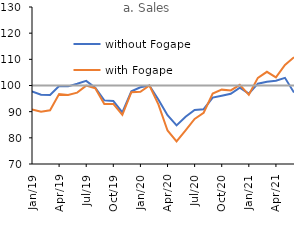
| Category | without Fogape | with Fogape | Series 2 |
|---|---|---|---|
| 2019-01-01 | 97.763 | 90.879 | 100 |
| 2019-02-01 | 96.495 | 89.952 | 100 |
| 2019-03-01 | 96.37 | 90.544 | 100 |
| 2019-04-01 | 99.784 | 96.74 | 100 |
| 2019-05-01 | 99.67 | 96.398 | 100 |
| 2019-06-01 | 100.644 | 97.279 | 100 |
| 2019-07-01 | 101.764 | 99.944 | 100 |
| 2019-08-01 | 99.19 | 98.973 | 100 |
| 2019-09-01 | 94.308 | 92.929 | 100 |
| 2019-10-01 | 94.094 | 92.975 | 100 |
| 2019-11-01 | 89.705 | 88.787 | 100 |
| 2019-12-01 | 97.803 | 97.458 | 100 |
| 2020-01-01 | 99.343 | 97.621 | 100 |
| 2020-02-01 | 100 | 100 | 100 |
| 2020-03-01 | 94.577 | 92.68 | 100 |
| 2020-04-01 | 88.648 | 82.816 | 100 |
| 2020-05-01 | 84.763 | 78.672 | 100 |
| 2020-06-01 | 88.091 | 82.875 | 100 |
| 2020-07-01 | 90.676 | 87.206 | 100 |
| 2020-08-01 | 90.939 | 89.572 | 100 |
| 2020-09-01 | 95.377 | 96.932 | 100 |
| 2020-10-01 | 96.104 | 98.419 | 100 |
| 2020-11-01 | 96.861 | 98.119 | 100 |
| 2020-12-01 | 99.202 | 100.236 | 100 |
| 2021-01-01 | 96.9 | 96.438 | 100 |
| 2021-02-01 | 100.696 | 102.908 | 100 |
| 2021-03-01 | 101.427 | 105.235 | 100 |
| 2021-04-01 | 101.792 | 103.091 | 100 |
| 2021-05-01 | 102.926 | 107.868 | 100 |
| 2021-06-01 | 97.306 | 110.778 | 100 |